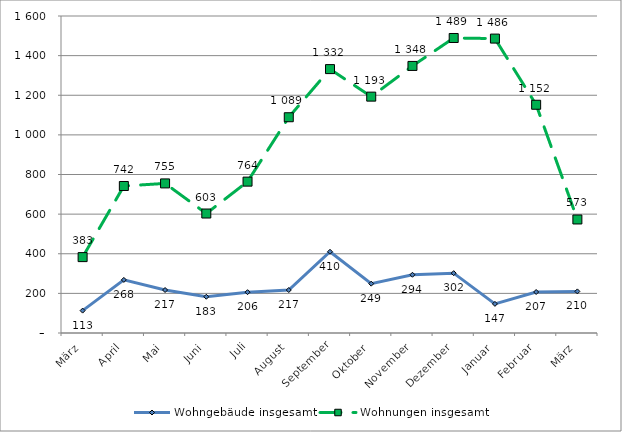
| Category | Wohngebäude insgesamt | Wohnungen insgesamt |
|---|---|---|
| März | 113 | 383 |
| April | 268 | 742 |
| Mai | 217 | 755 |
| Juni | 183 | 603 |
| Juli | 206 | 764 |
| August | 217 | 1089 |
| September | 410 | 1332 |
| Oktober | 249 | 1193 |
| November | 294 | 1348 |
| Dezember | 302 | 1489 |
| Januar | 147 | 1486 |
| Februar | 207 | 1152 |
| März | 210 | 573 |